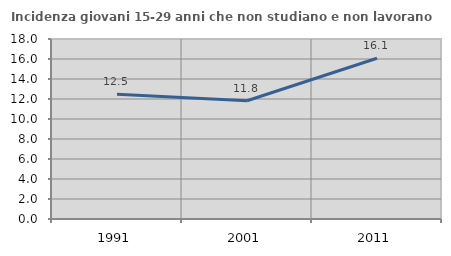
| Category | Incidenza giovani 15-29 anni che non studiano e non lavorano  |
|---|---|
| 1991.0 | 12.476 |
| 2001.0 | 11.823 |
| 2011.0 | 16.077 |